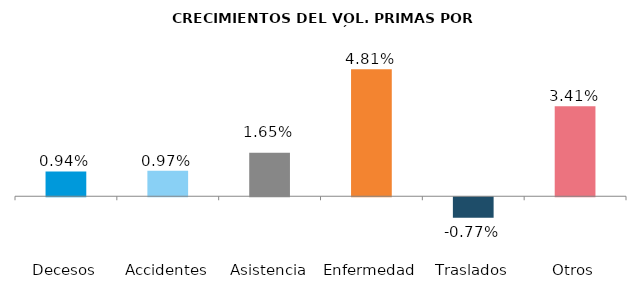
| Category | Series 0 |
|---|---|
| Decesos | 0.009 |
| Accidentes | 0.01 |
| Asistencia | 0.017 |
| Enfermedad | 0.048 |
| Traslados | -0.008 |
| Otros | 0.034 |